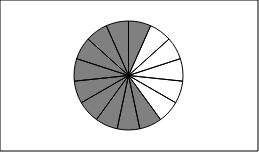
| Category | Series 0 | Series 1 |
|---|---|---|
| 0 | 1 |  |
| 1 | 1 |  |
| 2 | 1 |  |
| 3 | 1 |  |
| 4 | 1 |  |
| 5 | 1 |  |
| 6 | 1 |  |
| 7 | 1 |  |
| 8 | 1 |  |
| 9 | 1 |  |
| 10 | 1 |  |
| 11 | 1 |  |
| 12 | 1 |  |
| 13 | 1 |  |
| 14 | 1 |  |